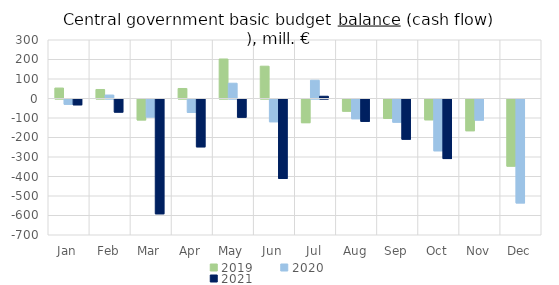
| Category | 2019 | 2020 | 2021 |
|---|---|---|---|
| Jan | 53602.821 | -27008.783 | -29796.233 |
| Feb | 46183.942 | 17739.259 | -67239.4 |
| Mar | -107468.775 | -92437.362 | -588782.516 |
| Apr | 51330.864 | -68618.758 | -245340.846 |
| May | 202574.984 | 78305.058 | -93535.942 |
| Jun | 165654.164 | -116676.414 | -407592.545 |
| Jul | -121455.657 | 93597.468 | 11498.308 |
| Aug | -62543.212 | -101242.931 | -114579.6 |
| Sep | -99242.65 | -118985.258 | -206249.905 |
| Oct | -106570.914 | -265582.087 | -305373.141 |
| Nov | -162750.844 | -108180.558 | 0 |
| Dec | -344358.909 | -532871.659 | 0 |